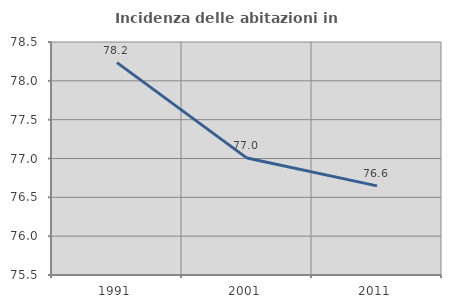
| Category | Incidenza delle abitazioni in proprietà  |
|---|---|
| 1991.0 | 78.234 |
| 2001.0 | 77.005 |
| 2011.0 | 76.648 |